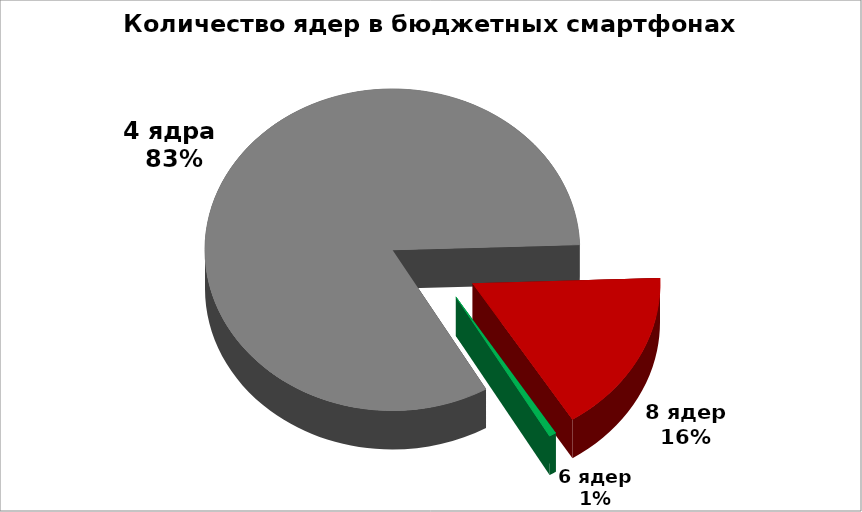
| Category | Series 0 |
|---|---|
| 4 ядра  | 135 |
| 8 ядер | 27 |
| 6 ядер | 1 |